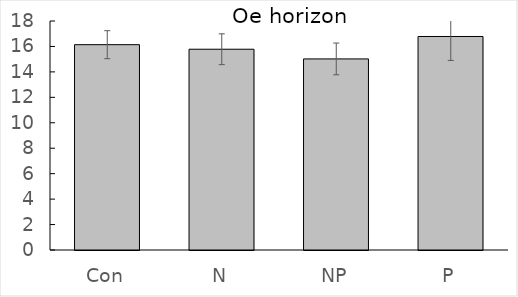
| Category | Series 0 |
|---|---|
| Con | 16.139 |
| N | 15.781 |
| NP | 15.02 |
| P | 16.782 |